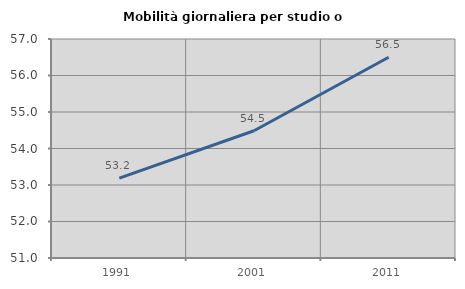
| Category | Mobilità giornaliera per studio o lavoro |
|---|---|
| 1991.0 | 53.188 |
| 2001.0 | 54.486 |
| 2011.0 | 56.501 |